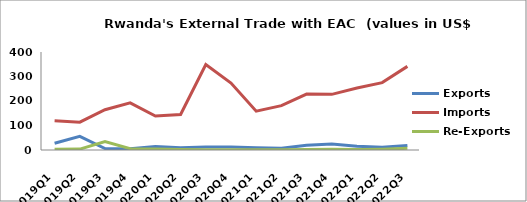
| Category | Exports | Imports | Re-Exports |
|---|---|---|---|
| 2019Q1 | 27.532 | 118.895 | 2.571 |
| 2019Q2 | 55.968 | 113.561 | 3.654 |
| 2019Q3 | 6.192 | 164.3 | 34.329 |
| 2019Q4 | 5.149 | 192.569 | 5.268 |
| 2020Q1 | 14.209 | 138.663 | 3.748 |
| 2020Q2 | 8.786 | 144.885 | 1.712 |
| 2020Q3 | 11.767 | 348.723 | 1.141 |
| 2020Q4 | 12.136 | 273.335 | 0.92 |
| 2021Q1 | 9.302 | 158.626 | 0.693 |
| 2021Q2 | 7.396 | 180.858 | 1.076 |
| 2021Q3 | 19.208 | 228.408 | 2.214 |
| 2021Q4 | 24.275 | 227.083 | 3.044 |
| 2022Q1 | 14.976 | 253.288 | 1.717 |
| 2022Q2 | 10.835 | 275.058 | 3.227 |
| 2022Q3 | 18.34 | 341.329 | 6.748 |